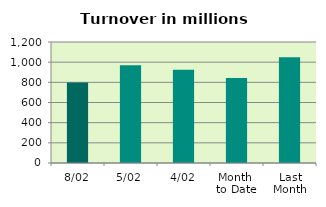
| Category | Series 0 |
|---|---|
| 8/02 | 797.324 |
| 5/02 | 968.878 |
| 4/02 | 925.862 |
| Month 
to Date | 843.385 |
| Last
Month | 1049.647 |